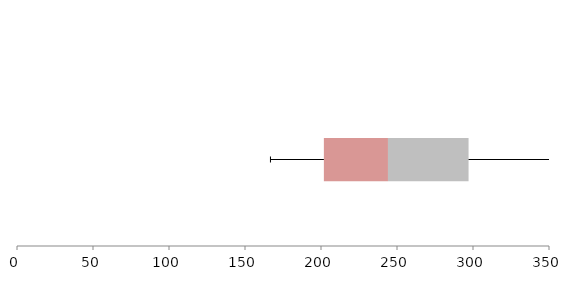
| Category | Series 1 | Series 2 | Series 3 |
|---|---|---|---|
| 0 | 201.891 | 42.166 | 53.019 |